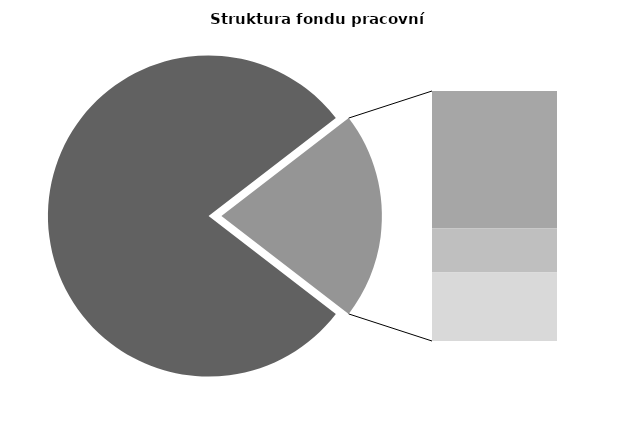
| Category | Series 0 |
|---|---|
| Průměrná měsíční odpracovaná doba bez přesčasu | 135.633 |
| Dovolená | 19.646 |
| Nemoc | 6.324 |
| Jiné | 9.823 |